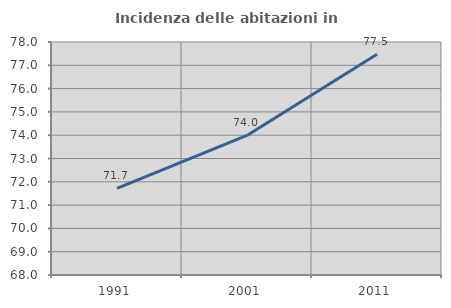
| Category | Incidenza delle abitazioni in proprietà  |
|---|---|
| 1991.0 | 71.719 |
| 2001.0 | 73.989 |
| 2011.0 | 77.472 |